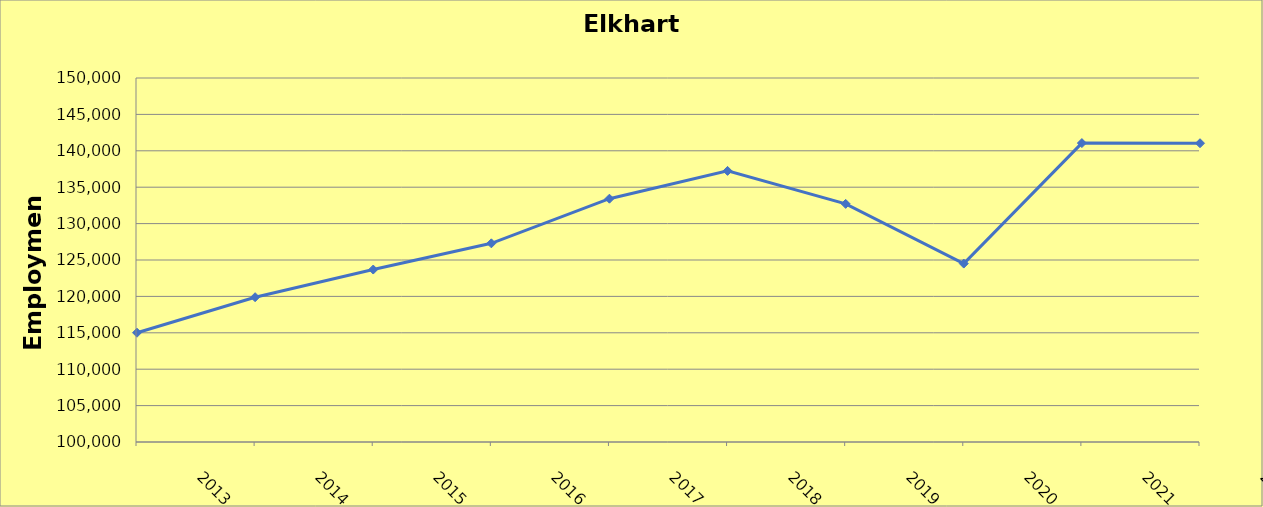
| Category | Elkhart County |
|---|---|
| 2013.0 | 115010 |
| 2014.0 | 119890 |
| 2015.0 | 123690 |
| 2016.0 | 127290 |
| 2017.0 | 133420 |
| 2018.0 | 137240 |
| 2019.0 | 132710 |
| 2020.0 | 124510 |
| 2021.0 | 141060 |
| 2022.0 | 141039 |